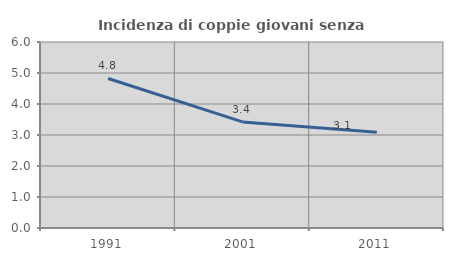
| Category | Incidenza di coppie giovani senza figli |
|---|---|
| 1991.0 | 4.823 |
| 2001.0 | 3.421 |
| 2011.0 | 3.088 |